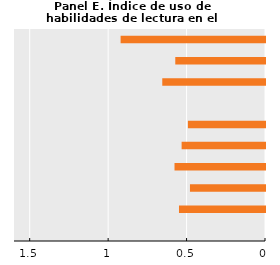
| Category | Series 0 |
|---|---|
| 0 | 0 |
| 1 | 0.548 |
| 2 | 0.478 |
| 3 | 0.577 |
| 4 | 0.532 |
| 5 | 0.491 |
| 6 | 0 |
| 7 | 0.655 |
| 8 | 0.572 |
| 9 | 0.921 |